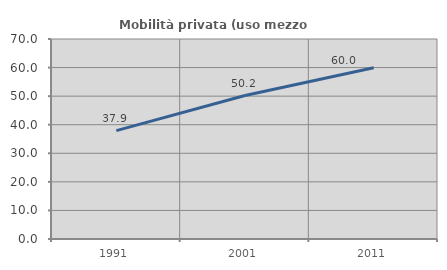
| Category | Mobilità privata (uso mezzo privato) |
|---|---|
| 1991.0 | 37.916 |
| 2001.0 | 50.223 |
| 2011.0 | 59.968 |